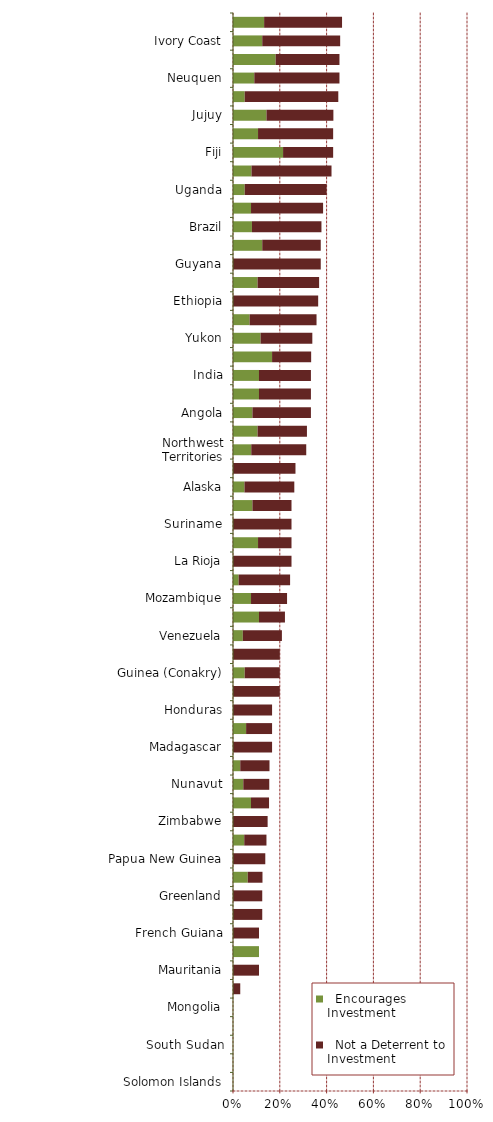
| Category |   Encourages Investment |   Not a Deterrent to Investment |
|---|---|---|
| Solomon Islands | 0 | 0 |
| Central African Republic | 0 | 0 |
| South Sudan | 0 | 0 |
| Sudan | 0 | 0 |
| Mongolia | 0 | 0 |
| Democratic Republic of Congo (DRC) | 0 | 0.031 |
| Mauritania | 0 | 0.111 |
| Nigeria | 0.111 | 0 |
| French Guiana | 0 | 0.111 |
| Eritrea | 0 | 0.125 |
| Greenland | 0 | 0.125 |
| Kyrgyzstan | 0.063 | 0.063 |
| Papua New Guinea | 0 | 0.138 |
| Bolivia | 0.048 | 0.095 |
| Zimbabwe | 0 | 0.148 |
| Myanmar | 0.077 | 0.077 |
| Nunavut | 0.044 | 0.111 |
| Mali | 0.031 | 0.125 |
| Madagascar | 0 | 0.167 |
| Niger | 0.056 | 0.111 |
| Honduras | 0 | 0.167 |
| Philippines | 0 | 0.2 |
| Guinea (Conakry) | 0.05 | 0.15 |
| Laos | 0 | 0.2 |
| Venezuela | 0.042 | 0.167 |
| Vietnam | 0.111 | 0.111 |
| Mozambique | 0.077 | 0.154 |
| Indonesia | 0.024 | 0.22 |
| La Rioja | 0 | 0.25 |
| Ecuador | 0.107 | 0.143 |
| Suriname | 0 | 0.25 |
| Kazakhstan | 0.083 | 0.167 |
| Alaska | 0.049 | 0.213 |
| Russia | 0 | 0.267 |
| Northwest Territories | 0.078 | 0.235 |
| Mendoza | 0.105 | 0.211 |
| Angola | 0.083 | 0.25 |
| Cambodia | 0.111 | 0.222 |
| India | 0.111 | 0.222 |
| Chubut | 0.167 | 0.167 |
| Yukon | 0.118 | 0.221 |
| Sierra Leone | 0.071 | 0.286 |
| Ethiopia | 0 | 0.364 |
| Santa Cruz | 0.105 | 0.263 |
| Guyana | 0 | 0.375 |
| Thailand | 0.125 | 0.25 |
| Brazil | 0.081 | 0.297 |
| Dominican Republic | 0.077 | 0.308 |
| Uganda | 0.05 | 0.35 |
| Colombia | 0.079 | 0.342 |
| Fiji | 0.214 | 0.214 |
| Burkina Faso | 0.107 | 0.321 |
| Jujuy | 0.143 | 0.286 |
| China | 0.05 | 0.4 |
| Neuquen | 0.091 | 0.364 |
| Guatemala | 0.182 | 0.273 |
| Ivory Coast | 0.125 | 0.333 |
| Rio Negro | 0.133 | 0.333 |